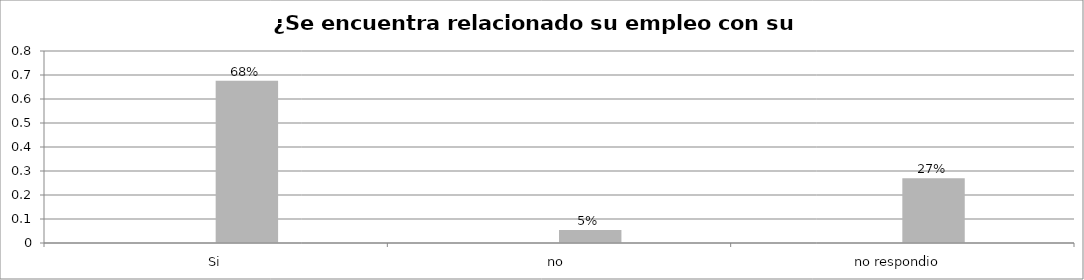
| Category | Series 0 | Series 1 | Series 2 | Series 3 |
|---|---|---|---|---|
| Si |  |  | 0.676 |  |
| no  |  |  | 0.054 |  |
| no respondio  |  |  | 0.27 |  |